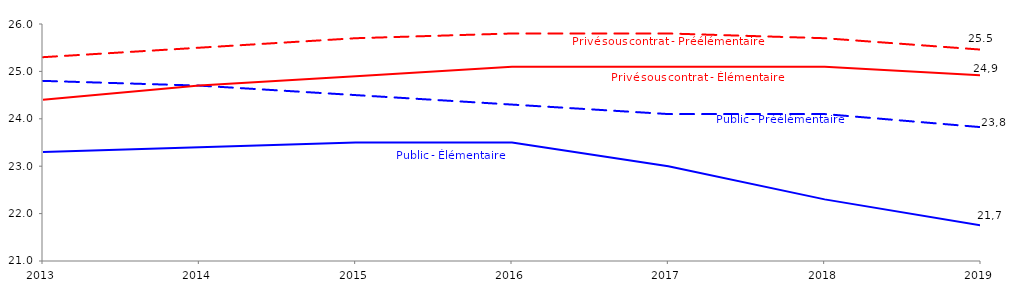
| Category | Public - Préélémentaire | Public - Élémentaire | Privé sous contrat - Préélémentaire | Privé sous contrat - Élémentaire |
|---|---|---|---|---|
| 2013.0 | 24.8 | 23.3 | 25.3 | 24.4 |
| 2014.0 | 24.7 | 23.4 | 25.5 | 24.7 |
| 2015.0 | 24.5 | 23.5 | 25.7 | 24.9 |
| 2016.0 | 24.3 | 23.5 | 25.8 | 25.1 |
| 2017.0 | 24.1 | 23 | 25.8 | 25.1 |
| 2018.0 | 24.1 | 22.3 | 25.7 | 25.1 |
| 2019.0 | 23.824 | 21.75 | 25.46 | 24.918 |